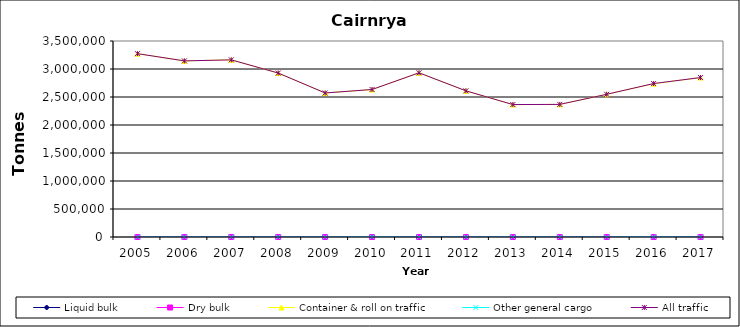
| Category | Liquid bulk | Dry bulk | Container & roll on traffic | Other general cargo | All traffic |
|---|---|---|---|---|---|
| 2005.0 | 0 | 0 | 3274000 | 0 | 3274000 |
| 2006.0 | 0 | 0 | 3145000 | 0 | 3145000 |
| 2007.0 | 0 | 0 | 3163000 | 0 | 3163000 |
| 2008.0 | 0 | 0 | 2928000 | 0 | 2928000 |
| 2009.0 | 0 | 0 | 2571913 | 0 | 2571913 |
| 2010.0 | 0 | 0 | 2632000 | 3000 | 2634000 |
| 2011.0 | 0 | 0 | 2932000 | 0 | 2932000 |
| 2012.0 | 0 | 0 | 2610000 | 0 | 2610000 |
| 2013.0 | 0 | 0 | 2364000 | 1000 | 2365000 |
| 2014.0 | 0 | 0 | 2368000 | 0 | 2368000 |
| 2015.0 | 0 | 0 | 2548000 | 0 | 2548000 |
| 2016.0 | 0 | 0 | 2737000 | 3000 | 2740000 |
| 2017.0 | 0 | 0 | 2847000 | 0 | 2847000 |